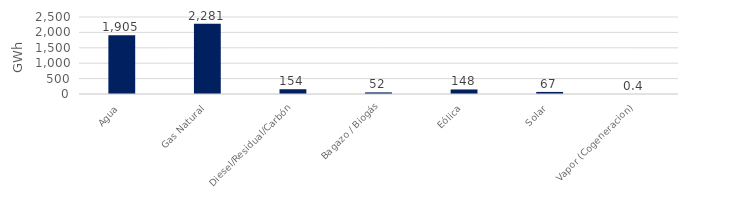
| Category | Series 0 |
|---|---|
| Agua | 1904.734 |
| Gas Natural | 2280.576 |
| Diesel/Residual/Carbón | 154.498 |
| Bagazo / Biogás | 52.378 |
| Eólica | 147.804 |
| Solar | 67.235 |
| Vapor (Cogeneracion) | 0.382 |